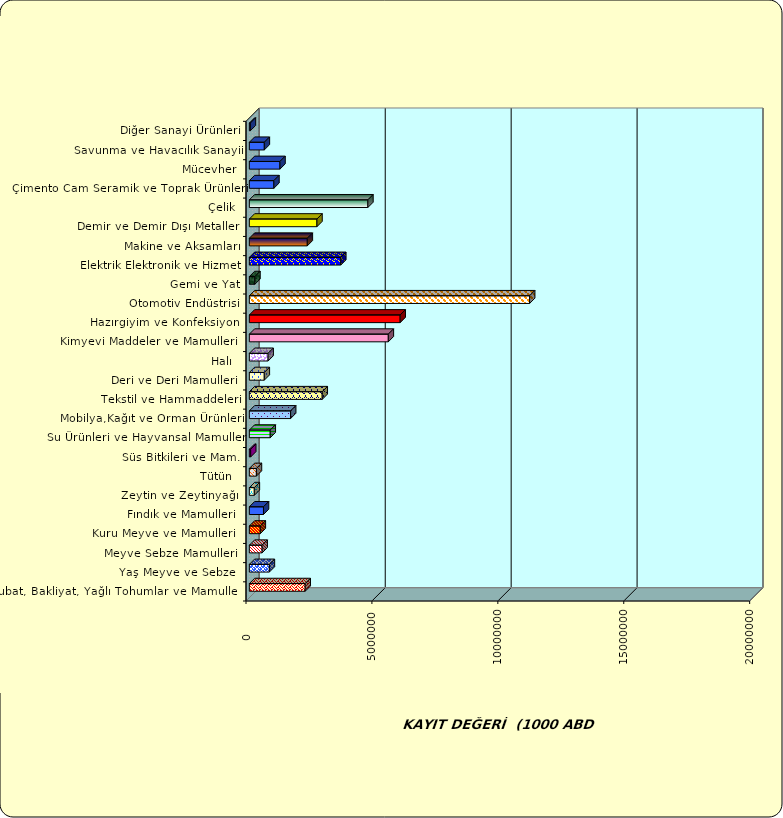
| Category | Series 0 |
|---|---|
|  Hububat, Bakliyat, Yağlı Tohumlar ve Mamulleri  | 2217579.278 |
|  Yaş Meyve ve Sebze   | 794634.112 |
|  Meyve Sebze Mamulleri  | 507744.001 |
|  Kuru Meyve ve Mamulleri   | 434627.956 |
|  Fındık ve Mamulleri  | 561442.489 |
|  Zeytin ve Zeytinyağı  | 197629.896 |
|  Tütün  | 280083.634 |
|  Süs Bitkileri ve Mam. | 53588.013 |
|  Su Ürünleri ve Hayvansal Mamuller | 829525.784 |
|  Mobilya,Kağıt ve Orman Ürünleri | 1638849.926 |
|  Tekstil ve Hammaddeleri | 2893936.009 |
|  Deri ve Deri Mamulleri  | 593185.072 |
|  Halı  | 745044.236 |
|  Kimyevi Maddeler ve Mamulleri   | 5518470.789 |
|  Hazırgiyim ve Konfeksiyon  | 5988368.527 |
|  Otomotiv Endüstrisi | 11129520.162 |
|  Gemi ve Yat | 220859.747 |
|  Elektrik Elektronik ve Hizmet | 3630035.604 |
|  Makine ve Aksamları | 2301052.349 |
|  Demir ve Demir Dışı Metaller  | 2684412.754 |
|  Çelik | 4706740.167 |
|  Çimento Cam Seramik ve Toprak Ürünleri | 974421.29 |
|  Mücevher | 1215773.201 |
|  Savunma ve Havacılık Sanayii | 594648.792 |
|  Diğer Sanayi Ürünleri | 40111.239 |